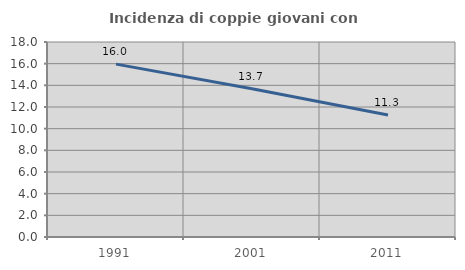
| Category | Incidenza di coppie giovani con figli |
|---|---|
| 1991.0 | 15.957 |
| 2001.0 | 13.679 |
| 2011.0 | 11.255 |